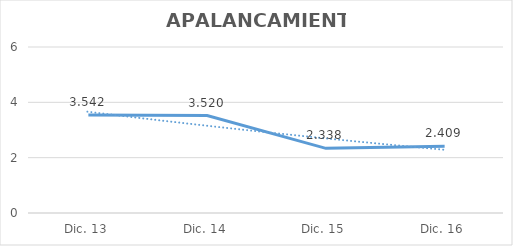
| Category | Series 0 |
|---|---|
| Dic. 13 | 3.542 |
| Dic. 14 | 3.52 |
| Dic. 15 | 2.338 |
| Dic. 16 | 2.409 |